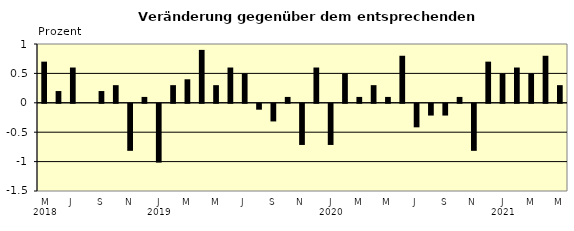
| Category | Series 0 |
|---|---|
| 0 | 0.7 |
| 1 | 0.2 |
| 2 | 0.6 |
| 3 | 0 |
| 4 | 0.2 |
| 5 | 0.3 |
| 6 | -0.8 |
| 7 | 0.1 |
| 8 | -1 |
| 9 | 0.3 |
| 10 | 0.4 |
| 11 | 0.9 |
| 12 | 0.3 |
| 13 | 0.6 |
| 14 | 0.5 |
| 15 | -0.1 |
| 16 | -0.3 |
| 17 | 0.1 |
| 18 | -0.7 |
| 19 | 0.6 |
| 20 | -0.7 |
| 21 | 0.5 |
| 22 | 0.1 |
| 23 | 0.3 |
| 24 | 0.1 |
| 25 | 0.8 |
| 26 | -0.4 |
| 27 | -0.2 |
| 28 | -0.2 |
| 29 | 0.1 |
| 30 | -0.8 |
| 31 | 0.7 |
| 32 | 0.5 |
| 33 | 0.6 |
| 34 | 0.5 |
| 35 | 0.8 |
| 36 | 0.3 |